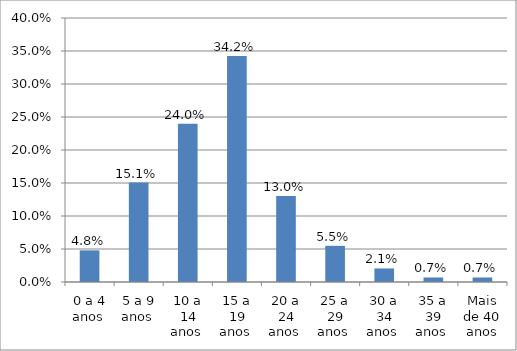
| Category | Series 0 |
|---|---|
| 0 a 4 anos  | 0.048 |
| 5 a 9 anos  | 0.151 |
| 10 a 14 anos  | 0.24 |
| 15 a 19 anos  | 0.342 |
| 20 a 24 anos  | 0.13 |
| 25 a 29 anos  | 0.055 |
| 30 a 34 anos  | 0.021 |
| 35 a 39 anos  | 0.007 |
| Mais de 40 anos | 0.007 |